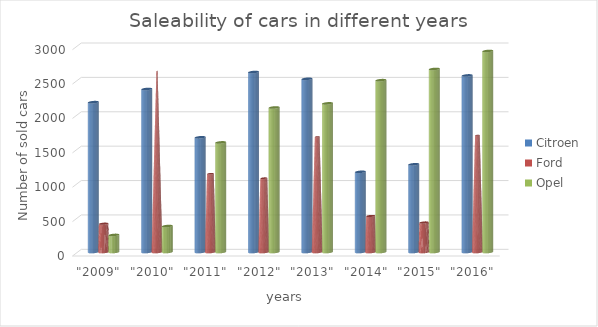
| Category | Citroen | Ford | Opel |
|---|---|---|---|
| "2009" | 2178.405 | 411.128 | 247.982 |
| "2010" | 2369.512 | 2631.696 | 377.227 |
| "2011" | 1667.576 | 1137.69 | 1593.214 |
| "2012" | 2616.503 | 1073.092 | 2100.898 |
| "2013" | 2517.64 | 1675.828 | 2160.829 |
| "2014" | 1165.534 | 523.736 | 2498.022 |
| "2015" | 1274.964 | 428.789 | 2661.05 |
| "2016" | 2566.977 | 1696.554 | 2922.338 |